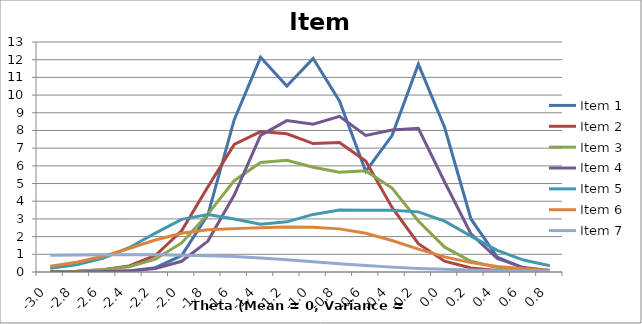
| Category | Item 1 | Item 2 | Item 3 | Item 4 | Item 5 | Item 6 | Item 7 |
|---|---|---|---|---|---|---|---|
| -3.0 | 0.001 | 0.016 | 0.019 | 0.002 | 0.205 | 0.33 | 0.946 |
| -2.8 | 0.004 | 0.044 | 0.049 | 0.007 | 0.403 | 0.552 | 0.967 |
| -2.6 | 0.016 | 0.124 | 0.122 | 0.02 | 0.768 | 0.886 | 0.976 |
| -2.4 | 0.062 | 0.345 | 0.301 | 0.064 | 1.373 | 1.328 | 0.977 |
| -2.2 | 0.243 | 0.932 | 0.724 | 0.198 | 2.2 | 1.807 | 0.97 |
| -2.0 | 0.926 | 2.327 | 1.644 | 0.604 | 2.974 | 2.188 | 0.953 |
| -1.8 | 3.247 | 4.823 | 3.274 | 1.746 | 3.254 | 2.383 | 0.922 |
| -1.6 | 8.611 | 7.206 | 5.163 | 4.35 | 2.991 | 2.452 | 0.869 |
| -1.4 | 12.135 | 7.934 | 6.192 | 7.724 | 2.705 | 2.499 | 0.791 |
| -1.2 | 10.507 | 7.814 | 6.313 | 8.556 | 2.835 | 2.539 | 0.691 |
| -1.0 | 12.068 | 7.259 | 5.917 | 8.348 | 3.254 | 2.531 | 0.579 |
| -0.8 | 9.673 | 7.32 | 5.643 | 8.8 | 3.506 | 2.438 | 0.466 |
| -0.6 | 5.693 | 6.271 | 5.716 | 7.717 | 3.494 | 2.193 | 0.363 |
| -0.4 | 7.708 | 3.646 | 4.744 | 8.02 | 3.49 | 1.779 | 0.275 |
| -0.2 | 11.747 | 1.6 | 2.884 | 8.125 | 3.398 | 1.291 | 0.204 |
| 0.0 | 8.169 | 0.615 | 1.403 | 5.088 | 2.877 | 0.854 | 0.149 |
| 0.2 | 2.997 | 0.224 | 0.608 | 2.155 | 2.026 | 0.53 | 0.108 |
| 0.4 | 0.847 | 0.08 | 0.251 | 0.761 | 1.227 | 0.315 | 0.077 |
| 0.6 | 0.221 | 0.028 | 0.101 | 0.251 | 0.675 | 0.183 | 0.055 |
| 0.8 | 0.057 | 0.01 | 0.04 | 0.081 | 0.351 | 0.104 | 0.039 |